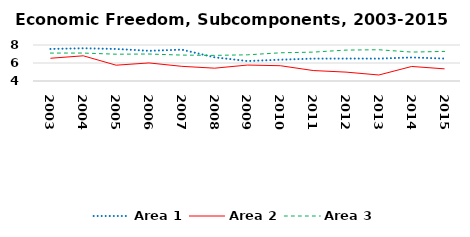
| Category | Area 1 | Area 2 | Area 3 |
|---|---|---|---|
| 2003.0 | 7.561 | 6.526 | 7.103 |
| 2004.0 | 7.633 | 6.8 | 7.106 |
| 2005.0 | 7.56 | 5.755 | 6.979 |
| 2006.0 | 7.355 | 6.008 | 6.998 |
| 2007.0 | 7.482 | 5.63 | 6.879 |
| 2008.0 | 6.629 | 5.424 | 6.849 |
| 2009.0 | 6.219 | 5.772 | 6.909 |
| 2010.0 | 6.368 | 5.698 | 7.133 |
| 2011.0 | 6.488 | 5.162 | 7.21 |
| 2012.0 | 6.493 | 4.986 | 7.435 |
| 2013.0 | 6.488 | 4.667 | 7.471 |
| 2014.0 | 6.615 | 5.615 | 7.213 |
| 2015.0 | 6.493 | 5.351 | 7.288 |